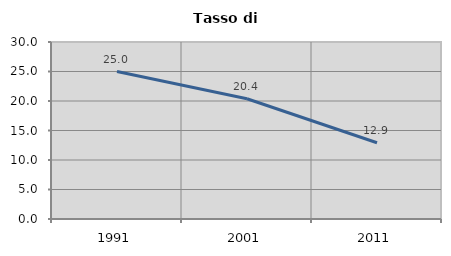
| Category | Tasso di disoccupazione   |
|---|---|
| 1991.0 | 25 |
| 2001.0 | 20.38 |
| 2011.0 | 12.921 |